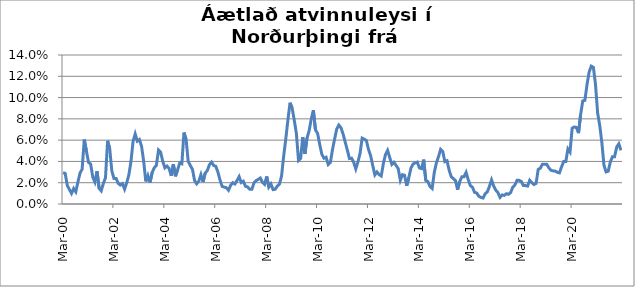
| Category | Series 0 |
|---|---|
| 2000-03-01 | 0.03 |
| 2000-04-01 | 0.029 |
| 2000-05-01 | 0.017 |
| 2000-06-01 | 0.014 |
| 2000-07-01 | 0.01 |
| 2000-08-01 | 0.015 |
| 2000-09-01 | 0.011 |
| 2000-10-01 | 0.021 |
| 2000-11-01 | 0.029 |
| 2000-12-01 | 0.033 |
| 2001-01-01 | 0.061 |
| 2001-02-01 | 0.05 |
| 2001-03-01 | 0.039 |
| 2001-04-01 | 0.038 |
| 2001-05-01 | 0.025 |
| 2001-06-01 | 0.021 |
| 2001-07-01 | 0.031 |
| 2001-08-01 | 0.015 |
| 2001-09-01 | 0.012 |
| 2001-10-01 | 0.019 |
| 2001-11-01 | 0.025 |
| 2001-12-01 | 0.059 |
| 2002-01-01 | 0.052 |
| 2002-02-01 | 0.031 |
| 2002-03-01 | 0.024 |
| 2002-04-01 | 0.024 |
| 2002-05-01 | 0.019 |
| 2002-06-01 | 0.018 |
| 2002-07-01 | 0.019 |
| 2002-08-01 | 0.014 |
| 2002-09-01 | 0.02 |
| 2002-10-01 | 0.027 |
| 2002-11-01 | 0.04 |
| 2002-12-01 | 0.059 |
| 2003-01-01 | 0.066 |
| 2003-02-01 | 0.059 |
| 2003-03-01 | 0.061 |
| 2003-04-01 | 0.054 |
| 2003-05-01 | 0.04 |
| 2003-06-01 | 0.021 |
| 2003-07-01 | 0.027 |
| 2003-08-01 | 0.02 |
| 2003-09-01 | 0.03 |
| 2003-10-01 | 0.034 |
| 2003-11-01 | 0.036 |
| 2003-12-01 | 0.051 |
| 2004-01-01 | 0.049 |
| 2004-02-01 | 0.04 |
| 2004-03-01 | 0.034 |
| 2004-04-01 | 0.036 |
| 2004-05-01 | 0.033 |
| 2004-06-01 | 0.027 |
| 2004-07-01 | 0.037 |
| 2004-08-01 | 0.026 |
| 2004-09-01 | 0.032 |
| 2004-10-01 | 0.039 |
| 2004-11-01 | 0.038 |
| 2004-12-01 | 0.067 |
| 2005-01-01 | 0.061 |
| 2005-02-01 | 0.04 |
| 2005-03-01 | 0.036 |
| 2005-04-01 | 0.033 |
| 2005-05-01 | 0.022 |
| 2005-06-01 | 0.019 |
| 2005-07-01 | 0.021 |
| 2005-08-01 | 0.028 |
| 2005-09-01 | 0.021 |
| 2005-10-01 | 0.029 |
| 2005-11-01 | 0.031 |
| 2005-12-01 | 0.037 |
| 2006-01-01 | 0.039 |
| 2006-02-01 | 0.036 |
| 2006-03-01 | 0.035 |
| 2006-04-01 | 0.03 |
| 2006-05-01 | 0.022 |
| 2006-06-01 | 0.016 |
| 2006-07-01 | 0.016 |
| 2006-08-01 | 0.015 |
| 2006-09-01 | 0.013 |
| 2006-10-01 | 0.018 |
| 2006-11-01 | 0.02 |
| 2006-12-01 | 0.019 |
| 2007-01-01 | 0.022 |
| 2007-02-01 | 0.026 |
| 2007-03-01 | 0.02 |
| 2007-04-01 | 0.021 |
| 2007-05-01 | 0.017 |
| 2007-06-01 | 0.016 |
| 2007-07-01 | 0.014 |
| 2007-08-01 | 0.014 |
| 2007-09-01 | 0.02 |
| 2007-10-01 | 0.022 |
| 2007-11-01 | 0.023 |
| 2007-12-01 | 0.024 |
| 2008-01-01 | 0.02 |
| 2008-02-01 | 0.018 |
| 2008-03-01 | 0.026 |
| 2008-04-01 | 0.016 |
| 2008-05-01 | 0.019 |
| 2008-06-01 | 0.014 |
| 2008-07-01 | 0.014 |
| 2008-08-01 | 0.017 |
| 2008-09-01 | 0.019 |
| 2008-10-01 | 0.026 |
| 2008-11-01 | 0.045 |
| 2008-12-01 | 0.061 |
| 2009-01-01 | 0.079 |
| 2009-02-01 | 0.095 |
| 2009-03-01 | 0.09 |
| 2009-04-01 | 0.079 |
| 2009-05-01 | 0.066 |
| 2009-06-01 | 0.041 |
| 2009-07-01 | 0.043 |
| 2009-08-01 | 0.063 |
| 2009-09-01 | 0.047 |
| 2009-10-01 | 0.062 |
| 2009-11-01 | 0.069 |
| 2009-12-01 | 0.08 |
| 2010-01-01 | 0.088 |
| 2010-02-01 | 0.07 |
| 2010-03-01 | 0.066 |
| 2010-04-01 | 0.056 |
| 2010-05-01 | 0.047 |
| 2010-06-01 | 0.043 |
| 2010-07-01 | 0.044 |
| 2010-08-01 | 0.037 |
| 2010-09-01 | 0.039 |
| 2010-10-01 | 0.051 |
| 2010-11-01 | 0.061 |
| 2010-12-01 | 0.07 |
| 2011-01-01 | 0.074 |
| 2011-02-01 | 0.072 |
| 2011-03-01 | 0.066 |
| 2011-04-01 | 0.058 |
| 2011-05-01 | 0.051 |
| 2011-06-01 | 0.043 |
| 2011-07-01 | 0.043 |
| 2011-08-01 | 0.039 |
| 2011-09-01 | 0.033 |
| 2011-10-01 | 0.039 |
| 2011-11-01 | 0.047 |
| 2011-12-01 | 0.062 |
| 2012-01-01 | 0.061 |
| 2012-02-01 | 0.06 |
| 2012-03-01 | 0.051 |
| 2012-04-01 | 0.045 |
| 2012-05-01 | 0.036 |
| 2012-06-01 | 0.027 |
| 2012-07-01 | 0.03 |
| 2012-08-01 | 0.028 |
| 2012-09-01 | 0.026 |
| 2012-10-01 | 0.038 |
| 2012-11-01 | 0.046 |
| 2012-12-01 | 0.05 |
| 2013-01-01 | 0.044 |
| 2013-02-01 | 0.037 |
| 2013-03-01 | 0.039 |
| 2013-04-01 | 0.036 |
| 2013-05-01 | 0.033 |
| 2013-06-01 | 0.022 |
| 2013-07-01 | 0.028 |
| 2013-08-01 | 0.027 |
| 2013-09-01 | 0.017 |
| 2013-10-01 | 0.025 |
| 2013-11-01 | 0.034 |
| 2013-12-01 | 0.038 |
| 2014-01-01 | 0.039 |
| 2014-02-01 | 0.039 |
| 2014-03-01 | 0.034 |
| 2014-04-01 | 0.033 |
| 2014-05-01 | 0.042 |
| 2014-06-01 | 0.022 |
| 2014-07-01 | 0.021 |
| 2014-08-01 | 0.016 |
| 2014-09-01 | 0.015 |
| 2014-10-01 | 0.03 |
| 2014-11-01 | 0.039 |
| 2014-12-01 | 0.044 |
| 2015-01-01 | 0.051 |
| 2015-02-01 | 0.049 |
| 2015-03-01 | 0.04 |
| 2015-04-01 | 0.041 |
| 2015-05-01 | 0.032 |
| 2015-06-01 | 0.026 |
| 2015-07-01 | 0.024 |
| 2015-08-01 | 0.022 |
| 2015-09-01 | 0.013 |
| 2015-10-01 | 0.021 |
| 2015-11-01 | 0.026 |
| 2015-12-01 | 0.026 |
| 2016-01-01 | 0.03 |
| 2016-02-01 | 0.023 |
| 2016-03-01 | 0.017 |
| 2016-04-01 | 0.016 |
| 2016-05-01 | 0.011 |
| 2016-06-01 | 0.01 |
| 2016-07-01 | 0.007 |
| 2016-08-01 | 0.006 |
| 2016-09-01 | 0.006 |
| 2016-10-01 | 0.01 |
| 2016-11-01 | 0.011 |
| 2016-12-01 | 0.016 |
| 2017-01-01 | 0.023 |
| 2017-02-01 | 0.017 |
| 2017-03-01 | 0.013 |
| 2017-04-01 | 0.011 |
| 2017-05-01 | 0.006 |
| 2017-06-01 | 0.008 |
| 2017-07-01 | 0.008 |
| 2017-08-01 | 0.01 |
| 2017-09-01 | 0.009 |
| 2017-10-01 | 0.011 |
| 2017-11-01 | 0.016 |
| 2017-12-01 | 0.018 |
| 2018-01-01 | 0.022 |
| 2018-02-01 | 0.022 |
| 2018-03-01 | 0.021 |
| 2018-04-01 | 0.017 |
| 2018-05-01 | 0.017 |
| 2018-06-01 | 0.017 |
| 2018-07-01 | 0.022 |
| 2018-08-01 | 0.02 |
| 2018-09-01 | 0.018 |
| 2018-10-01 | 0.019 |
| 2018-11-01 | 0.033 |
| 2018-12-01 | 0.034 |
| 2019-01-01 | 0.037 |
| 2019-02-01 | 0.037 |
| 2019-03-01 | 0.037 |
| 2019-04-01 | 0.034 |
| 2019-05-01 | 0.032 |
| 2019-06-01 | 0.031 |
| 2019-07-01 | 0.031 |
| 2019-08-01 | 0.03 |
| 2019-09-01 | 0.029 |
| 2019-10-01 | 0.035 |
| 2019-11-01 | 0.04 |
| 2019-12-01 | 0.04 |
| 2020-01-01 | 0.052 |
| 2020-02-01 | 0.049 |
| 2020-03-01 | 0.071 |
| 2020-04-01 | 0.072 |
| 2020-05-01 | 0.072 |
| 2020-06-01 | 0.067 |
| 2020-07-01 | 0.084 |
| 2020-08-01 | 0.097 |
| 2020-09-01 | 0.097 |
| 2020-10-01 | 0.112 |
| 2020-11-01 | 0.124 |
| 2020-12-01 | 0.13 |
| 2021-01-01 | 0.128 |
| 2021-02-01 | 0.113 |
| 2021-03-01 | 0.086 |
| 2021-04-01 | 0.074 |
| 2021-05-01 | 0.058 |
| 2021-06-01 | 0.036 |
| 2021-07-01 | 0.03 |
| 2021-08-01 | 0.031 |
| 2021-09-01 | 0.039 |
| 2021-10-01 | 0.044 |
| 2021-11-01 | 0.044 |
| 2021-12-01 | 0.053 |
| 2022-01-01 | 0.056 |
| 2022-02-01 | 0.05 |